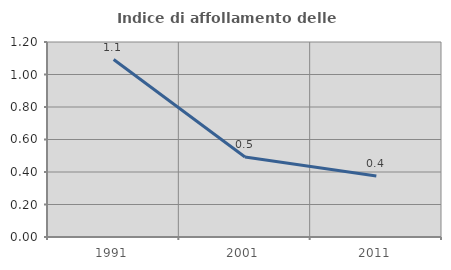
| Category | Indice di affollamento delle abitazioni  |
|---|---|
| 1991.0 | 1.092 |
| 2001.0 | 0.493 |
| 2011.0 | 0.375 |